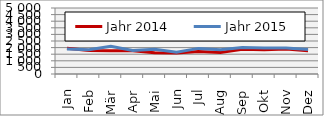
| Category | Jahr 2014 | Jahr 2015 |
|---|---|---|
| Jan | 1942.191 | 1891.558 |
| Feb | 1787.479 | 1838.642 |
| Mär | 1765.477 | 2108.779 |
| Apr | 1758.068 | 1775.717 |
| Mai | 1617.473 | 1872.835 |
| Jun | 1586.258 | 1649.455 |
| Jul | 1711.611 | 1940.571 |
| Aug | 1638.236 | 1839.414 |
| Sep | 1872.312 | 2012.485 |
| Okt | 1835.114 | 1975.586 |
| Nov | 1894.041 | 1966.029 |
| Dez | 1756.61 | 1859.906 |